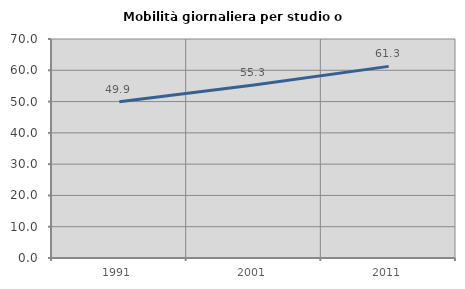
| Category | Mobilità giornaliera per studio o lavoro |
|---|---|
| 1991.0 | 49.949 |
| 2001.0 | 55.286 |
| 2011.0 | 61.254 |